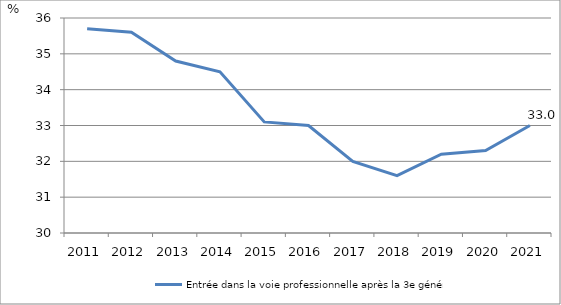
| Category | Entrée dans la voie professionnelle après la 3e générale |
|---|---|
| 2011.0 | 35.7 |
| 2012.0 | 35.6 |
| 2013.0 | 34.8 |
| 2014.0 | 34.5 |
| 2015.0 | 33.1 |
| 2016.0 | 33 |
| 2017.0 | 32 |
| 2018.0 | 31.6 |
| 2019.0 | 32.2 |
| 2020.0 | 32.3 |
| 2021.0 | 33 |